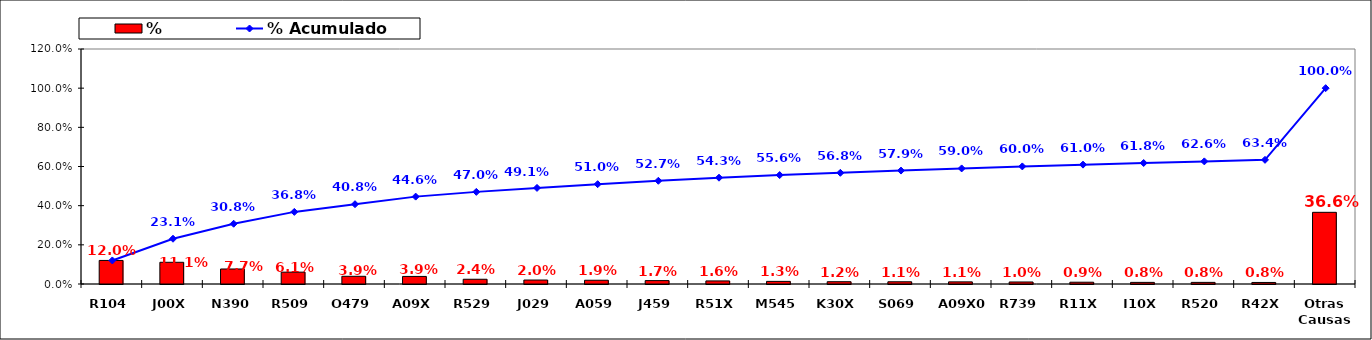
| Category | % |
|---|---|
| R104 | 0.12 |
| J00X | 0.111 |
| N390 | 0.077 |
| R509 | 0.061 |
| O479 | 0.039 |
| A09X | 0.039 |
| R529 | 0.024 |
| J029 | 0.02 |
| A059 | 0.019 |
| J459 | 0.017 |
| R51X | 0.016 |
| M545 | 0.013 |
| K30X | 0.012 |
| S069 | 0.011 |
| A09X0 | 0.011 |
| R739 | 0.01 |
| R11X | 0.009 |
| I10X | 0.008 |
| R520 | 0.008 |
| R42X | 0.008 |
| Otras Causas | 0.366 |